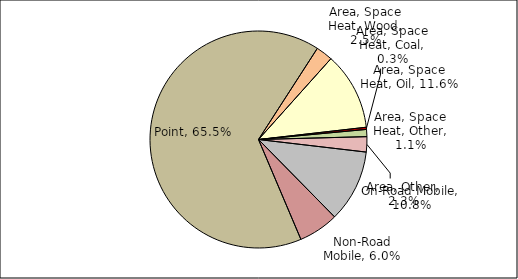
| Category | Series 0 |
|---|---|
| Point | 0.655 |
| Area, Space Heat, Wood | 0.025 |
| Area, Space Heat, Oil | 0.116 |
| Area, Space Heat, Coal | 0.003 |
| Area, Space Heat, Other | 0.011 |
| Area, Other | 0.023 |
| On-Road Mobile | 0.108 |
| Non-Road Mobile | 0.06 |